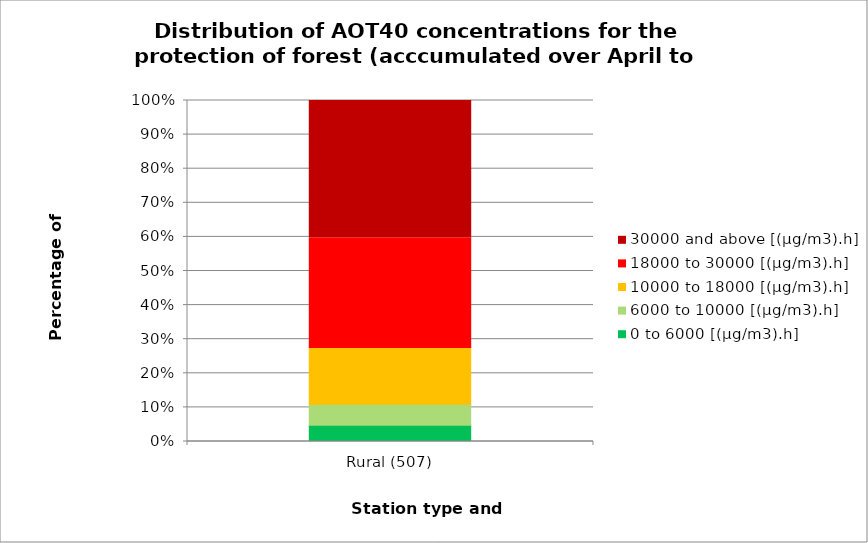
| Category | 0 to 6000 [(µg/m3).h] | 6000 to 10000 [(µg/m3).h] | 10000 to 18000 [(µg/m3).h] | 18000 to 30000 [(µg/m3).h] | 30000 and above [(µg/m3).h] |
|---|---|---|---|---|---|
| Rural (507) | 0.048 | 0.062 | 0.167 | 0.321 | 0.403 |